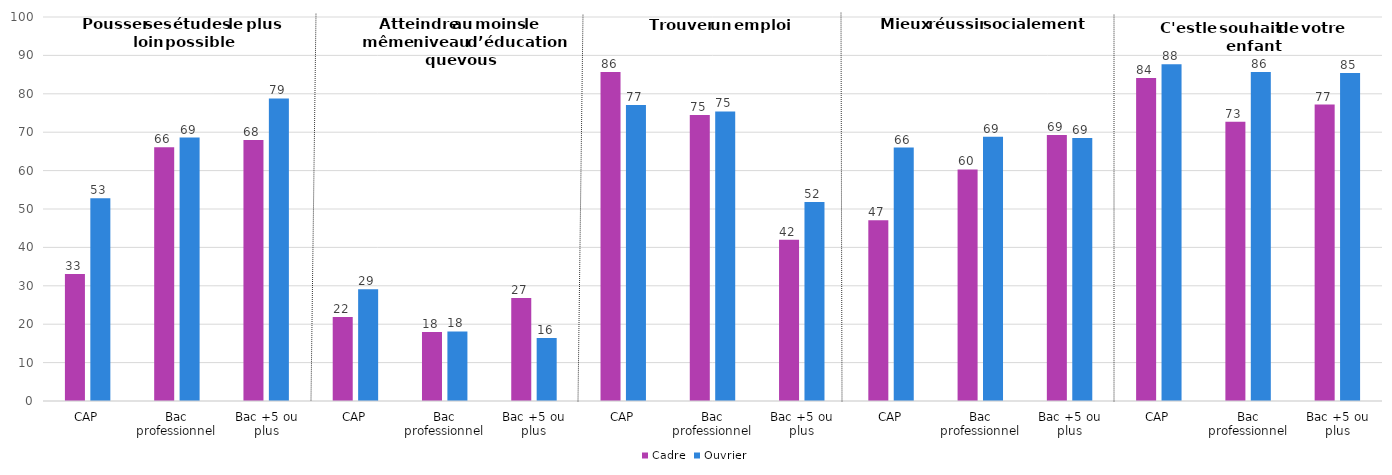
| Category | Cadre | Ouvrier |
|---|---|---|
| CAP | 33.1 | 52.8 |
| Bac professionnel | 66.1 | 68.6 |
| Bac +5 ou plus | 68 | 78.8 |
| CAP | 21.9 | 29.1 |
| Bac professionnel | 18 | 18.1 |
| Bac +5 ou plus | 26.8 | 16.4 |
| CAP | 85.7 | 77.1 |
| Bac professionnel | 74.5 | 75.4 |
| Bac +5 ou plus | 42 | 51.8 |
| CAP | 47.1 | 66 |
| Bac professionnel | 60.3 | 68.8 |
| Bac +5 ou plus | 69.3 | 68.5 |
| CAP | 84.1 | 87.7 |
| Bac professionnel | 72.7 | 85.7 |
| Bac +5 ou plus | 77.2 | 85.4 |